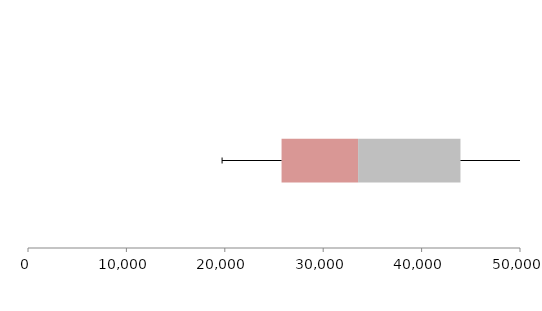
| Category | Series 1 | Series 2 | Series 3 |
|---|---|---|---|
| 0 | 25768.383 | 7778.797 | 10402.158 |